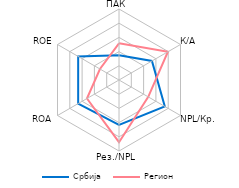
| Category | Србија | Регион |
|---|---|---|
| ПАК | 1.746 | 2.584 |
| К/А | 2.678 | 3.976 |
| NPL/Кр. | 3.725 | 2.38 |
| Рез./NPL | 3.162 | 4.379 |
| ROA | 3.32 | 2.605 |
| ROE | 3.32 | 1.549 |